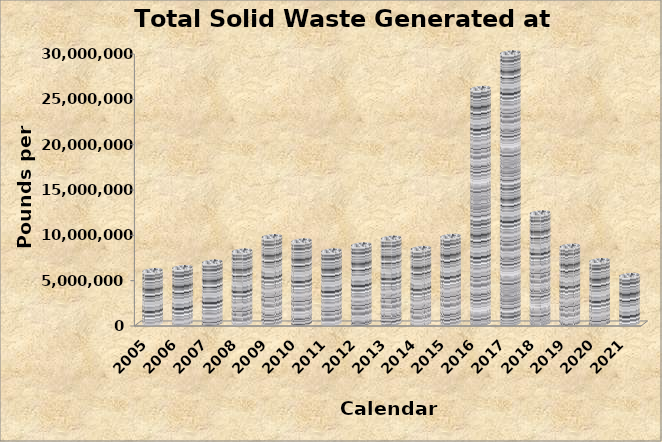
| Category | Calendar Year |
|---|---|
| 2021 | 5318357.5 |
| 2020 | 6956862 |
| 2019 | 8541964.676 |
| 2018 | 12217590.46 |
| 2017 | 29868250.5 |
| 2016 | 25941496.47 |
| 2015 | 9632871 |
| 2014 | 8286081 |
| 2013 | 9431786 |
| 2012 | 8680436 |
| 2011 | 8023186 |
| 2010 | 9127127 |
| 2009 | 9594815 |
| 2008 | 8011387 |
| 2007 | 6796580 |
| 2006 | 6180709 |
| 2005 | 5841672 |